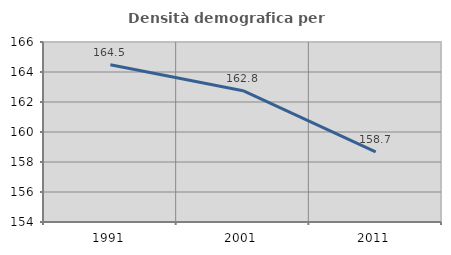
| Category | Densità demografica |
|---|---|
| 1991.0 | 164.487 |
| 2001.0 | 162.756 |
| 2011.0 | 158.674 |